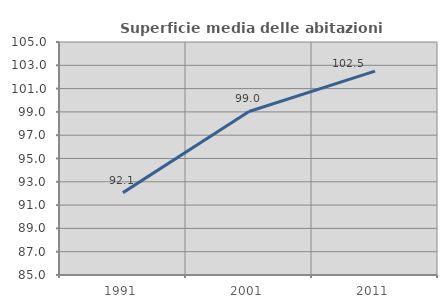
| Category | Superficie media delle abitazioni occupate |
|---|---|
| 1991.0 | 92.072 |
| 2001.0 | 99.039 |
| 2011.0 | 102.495 |